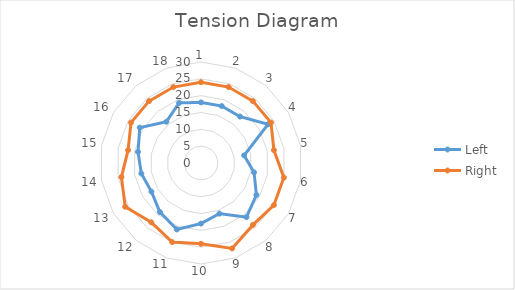
| Category | Left | Right |
|---|---|---|
| 0 | 18 | 24 |
| 1 | 18 | 24 |
| 2 | 18 | 24 |
| 3 | 23 | 24 |
| 4 | 13 | 22 |
| 5 | 16 | 25 |
| 6 | 19 | 25 |
| 7 | 21 | 24 |
| 8 | 16 | 27 |
| 9 | 18 | 24 |
| 10 | 21 | 25 |
| 11 | 19 | 23 |
| 12 | 17 | 26 |
| 13 | 18 | 24 |
| 14 | 19 | 22 |
| 15 | 21 | 24 |
| 16 | 16 | 24 |
| 17 | 19 | 24 |